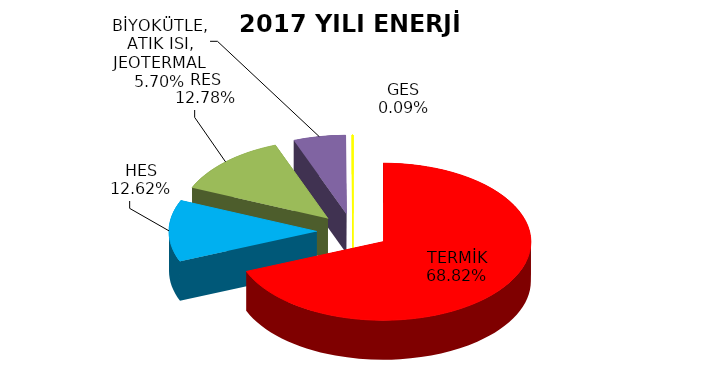
| Category | Series 0 |
|---|---|
| TERMİK | 4019.402 |
| HES | 736.921 |
| RES | 746.315 |
| BİYOKÜTLE, ATIK ISI, JEOTERMAL | 332.823 |
| GES | 5 |